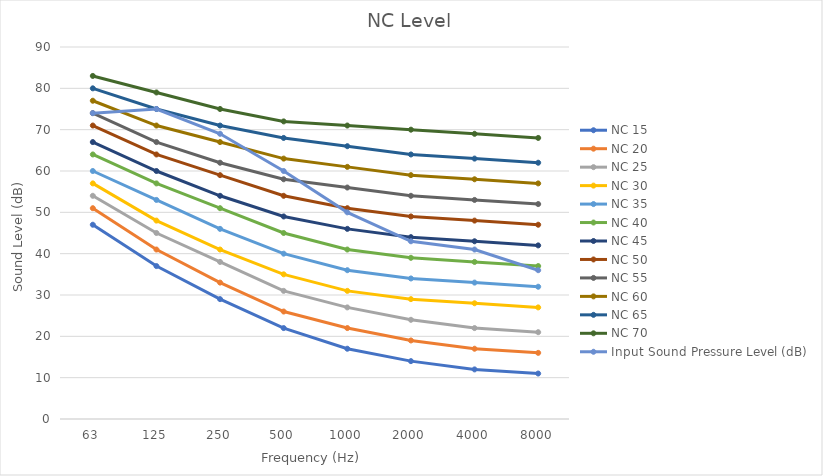
| Category | NC 15 | NC 20 | NC 25 | NC 30 | NC 35 | NC 40 | NC 45 | NC 50 | NC 55 | NC 60 | NC 65 | NC 70 | Input Sound Pressure Level (dB) |
|---|---|---|---|---|---|---|---|---|---|---|---|---|---|
| 63.0 | 47 | 51 | 54 | 57 | 60 | 64 | 67 | 71 | 74 | 77 | 80 | 83 | 74 |
| 125.0 | 37 | 41 | 45 | 48 | 53 | 57 | 60 | 64 | 67 | 71 | 75 | 79 | 75 |
| 250.0 | 29 | 33 | 38 | 41 | 46 | 51 | 54 | 59 | 62 | 67 | 71 | 75 | 69 |
| 500.0 | 22 | 26 | 31 | 35 | 40 | 45 | 49 | 54 | 58 | 63 | 68 | 72 | 60 |
| 1000.0 | 17 | 22 | 27 | 31 | 36 | 41 | 46 | 51 | 56 | 61 | 66 | 71 | 50 |
| 2000.0 | 14 | 19 | 24 | 29 | 34 | 39 | 44 | 49 | 54 | 59 | 64 | 70 | 43 |
| 4000.0 | 12 | 17 | 22 | 28 | 33 | 38 | 43 | 48 | 53 | 58 | 63 | 69 | 41 |
| 8000.0 | 11 | 16 | 21 | 27 | 32 | 37 | 42 | 47 | 52 | 57 | 62 | 68 | 36 |